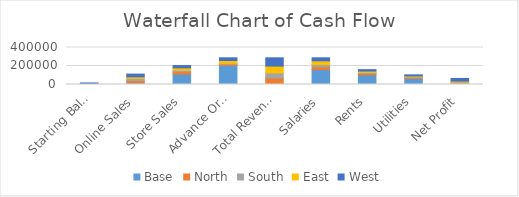
| Category | Base | North | South | East | West |
|---|---|---|---|---|---|
| Starting Balance | 0 | 4200 | 3800 | 3100 | 5600 |
| Online Sales | 16700 | 26000 | 24000 | 16000 | 30000 |
| Store Sales | 112700 | 26000 | 16000 | 25000 | 25000 |
| Advance Order | 204700 | 14000 | 11000 | 30000 | 29000 |
| Total Revenue | 0 | 70200 | 54800 | 74100 | 89600 |
| Salaries | 160700 | 30000 | 25000 | 40000 | 33000 |
| Rents | 104280 | 15000 | 11000 | 14820 | 15600 |
| Utilities | 65580 | 9000 | 8000 | 9500 | 12200 |
| Net Profit | 0 | 16200 | 10800 | 9780 | 28800 |